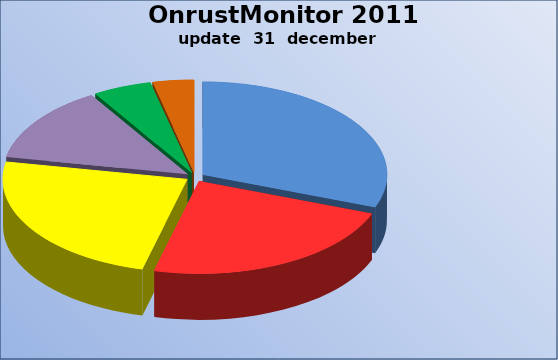
| Category | OnrustMonitor 2011 |
|---|---|
| petities /handtkeningenacties | 102 |
| demonstraties /manifestaties | 77 |
| overige acties | 80 |
| stakingen / werkonderbrekingen | 44 |
| publiek(vriendelijke) acties | 17 |
| bezettingen / blokkades | 12 |